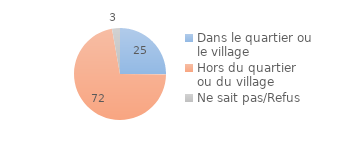
| Category | Series 0 |
|---|---|
| Dans le quartier ou le village | 25.134 |
| Hors du quartier ou du village | 72.068 |
| Ne sait pas/Refus | 2.797 |